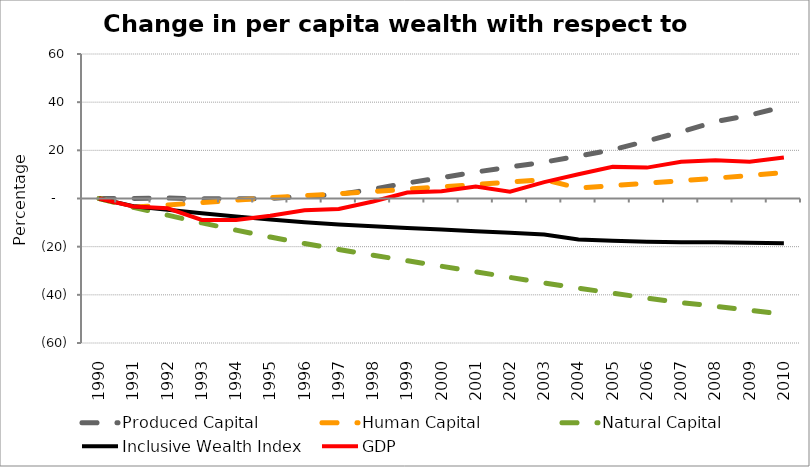
| Category | Produced Capital  | Human Capital | Natural Capital | Inclusive Wealth Index | GDP |
|---|---|---|---|---|---|
| 1990.0 | 0 | 0 | 0 | 0 | 0 |
| 1991.0 | -0.01 | -3.559 | -3.616 | -3.182 | -3.333 |
| 1992.0 | 0.202 | -2.668 | -6.92 | -4.682 | -4.089 |
| 1993.0 | -0.146 | -1.699 | -10.112 | -6.159 | -8.921 |
| 1994.0 | -0.158 | -0.672 | -13.113 | -7.472 | -8.932 |
| 1995.0 | -0.012 | 0.312 | -16.011 | -8.725 | -7.203 |
| 1996.0 | 0.972 | 1.115 | -18.675 | -9.812 | -4.889 |
| 1997.0 | 1.714 | 2.003 | -21.165 | -10.804 | -4.376 |
| 1998.0 | 3.856 | 2.932 | -23.546 | -11.559 | -1.231 |
| 1999.0 | 6.418 | 3.884 | -25.843 | -12.214 | 2.445 |
| 2000.0 | 8.655 | 4.849 | -28.119 | -12.889 | 3.033 |
| 2001.0 | 10.97 | 5.812 | -30.436 | -13.578 | 4.96 |
| 2002.0 | 13.087 | 6.848 | -32.749 | -14.264 | 2.861 |
| 2003.0 | 15.111 | 7.846 | -35.073 | -14.979 | 6.795 |
| 2004.0 | 17.611 | 4.352 | -37.228 | -17.045 | 10.049 |
| 2005.0 | 20.276 | 5.36 | -39.292 | -17.54 | 13.13 |
| 2006.0 | 23.832 | 6.331 | -41.353 | -17.942 | 12.826 |
| 2007.0 | 27.686 | 7.343 | -43.244 | -18.204 | 15.25 |
| 2008.0 | 31.886 | 8.426 | -44.731 | -18.178 | 15.832 |
| 2009.0 | 34.585 | 9.583 | -46.406 | -18.405 | 15.248 |
| 2010.0 | 38.152 | 10.79 | -48.122 | -18.538 | 16.982 |